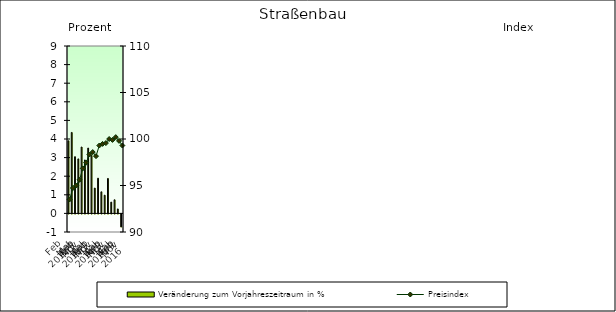
| Category | Veränderung zum Vorjahreszeitraum in % |
|---|---|
| 0 | 3.902 |
| 1 | 4.352 |
| 2 | 3.048 |
| 3 | 2.93 |
| 4 | 3.568 |
| 5 | 2.873 |
| 6 | 3.512 |
| 7 | 3.122 |
| 8 | 1.36 |
| 9 | 1.892 |
| 10 | 1.161 |
| 11 | 0.98 |
| 12 | 1.878 |
| 13 | 0.607 |
| 14 | 0.731 |
| 15 | 0.24 |
| 16 | -0.7 |